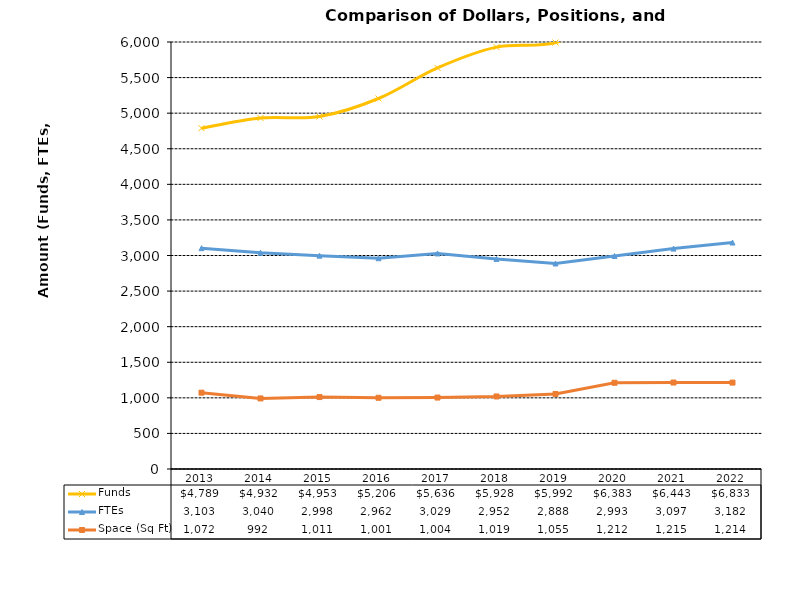
| Category | Funds | FTEs | Space (Sq Ft) |
|---|---|---|---|
| 2013.0 | 4789.014 | 3103 | 1072.41 |
| 2014.0 | 4932.368 | 3040 | 991.644 |
| 2015.0 | 4952.593 | 2998 | 1010.876 |
| 2016.0 | 5206.174 | 2962 | 1000.815 |
| 2017.0 | 5636.393 | 3029 | 1003.896 |
| 2018.0 | 5928 | 2952 | 1019.284 |
| 2019.0 | 5992 | 2888 | 1054.501 |
| 2020.0 | 6383 | 2993 | 1211.944 |
| 2021.0 | 6443 | 3097 | 1215 |
| 2022.0 | 6833 | 3182 | 1214 |